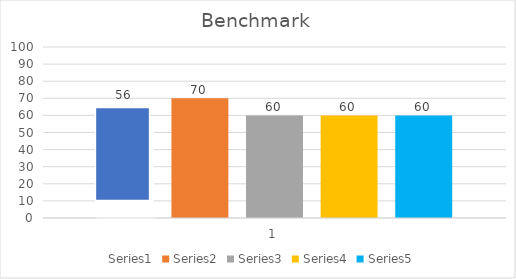
| Category | Series 0 | Series 1 | Series 2 | Series 3 | Series 4 |
|---|---|---|---|---|---|
| 0 | 56 | 70 | 60 | 60 | 60 |